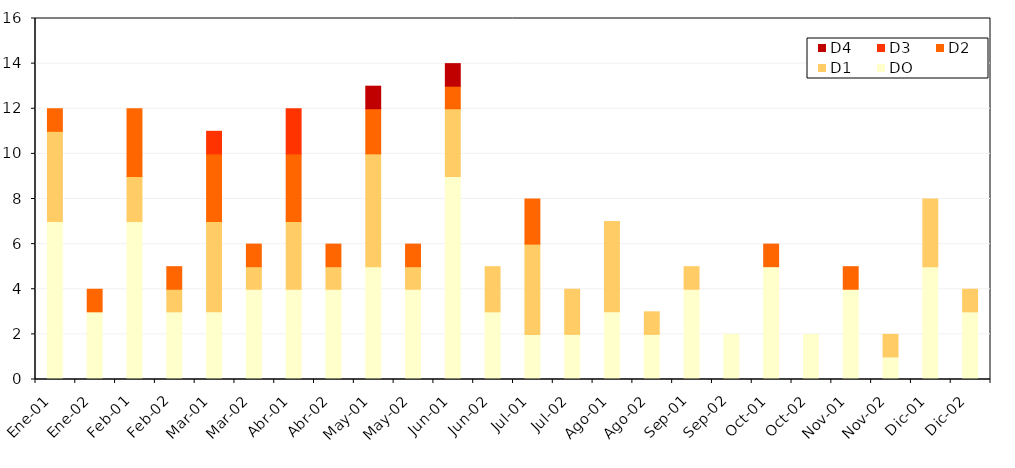
| Category | DO | D1 | D2 | D3 | D4 |
|---|---|---|---|---|---|
| Ene-01 | 7 | 4 | 1 | 0 | 0 |
| Ene-02 | 3 | 0 | 1 | 0 | 0 |
| Feb-01 | 7 | 2 | 3 | 0 | 0 |
| Feb-02 | 3 | 1 | 1 | 0 | 0 |
| Mar-01 | 3 | 4 | 3 | 1 | 0 |
| Mar-02 | 4 | 1 | 1 | 0 | 0 |
| Abr-01 | 4 | 3 | 3 | 2 | 0 |
| Abr-02 | 4 | 1 | 1 | 0 | 0 |
| May-01 | 5 | 5 | 2 | 0 | 1 |
| May-02 | 4 | 1 | 1 | 0 | 0 |
| Jun-01 | 9 | 3 | 1 | 0 | 1 |
| Jun-02 | 3 | 2 | 0 | 0 | 0 |
| Jul-01 | 2 | 4 | 2 | 0 | 0 |
| Jul-02 | 2 | 2 | 0 | 0 | 0 |
| Ago-01 | 3 | 4 | 0 | 0 | 0 |
| Ago-02 | 2 | 1 | 0 | 0 | 0 |
| Sep-01 | 4 | 1 | 0 | 0 | 0 |
| Sep-02 | 2 | 0 | 0 | 0 | 0 |
| Oct-01 | 5 | 0 | 1 | 0 | 0 |
| Oct-02 | 2 | 0 | 0 | 0 | 0 |
| Nov-01 | 4 | 0 | 1 | 0 | 0 |
| Nov-02 | 1 | 1 | 0 | 0 | 0 |
| Dic-01 | 5 | 3 | 0 | 0 | 0 |
| Dic-02 | 3 | 1 | 0 | 0 | 0 |